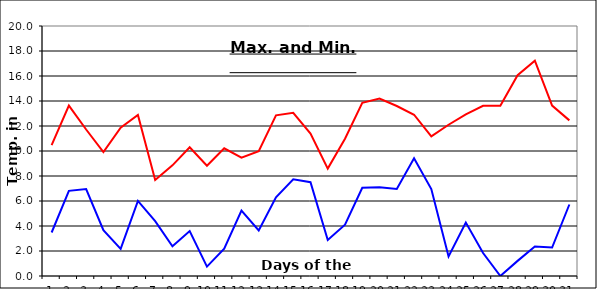
| Category | Series 0 | Series 1 |
|---|---|---|
| 0 | 10.47 | 3.48 |
| 1 | 13.63 | 6.81 |
| 2 | 11.72 | 6.95 |
| 3 | 9.92 | 3.66 |
| 4 | 11.87 | 2.17 |
| 5 | 12.89 | 6.01 |
| 6 | 7.68 | 4.39 |
| 7 | 8.85 | 2.38 |
| 8 | 10.3 | 3.6 |
| 9 | 8.82 | 0.75 |
| 10 | 10.22 | 2.19 |
| 11 | 9.46 | 5.24 |
| 12 | 9.99 | 3.65 |
| 13 | 12.85 | 6.3 |
| 14 | 13.05 | 7.74 |
| 15 | 11.4 | 7.5 |
| 16 | 8.59 | 2.88 |
| 17 | 10.98 | 4.1 |
| 18 | 13.85 | 7.06 |
| 19 | 14.2 | 7.1 |
| 20 | 13.6 | 6.97 |
| 21 | 12.9 | 9.42 |
| 22 | 11.17 | 6.95 |
| 23 | 12.1 | 1.57 |
| 24 | 12.93 | 4.28 |
| 25 | 13.62 | 1.84 |
| 26 | 13.62 | 0 |
| 27 | 16.06 | 1.21 |
| 28 | 17.23 | 2.36 |
| 29 | 13.63 | 2.28 |
| 30 | 12.45 | 5.72 |